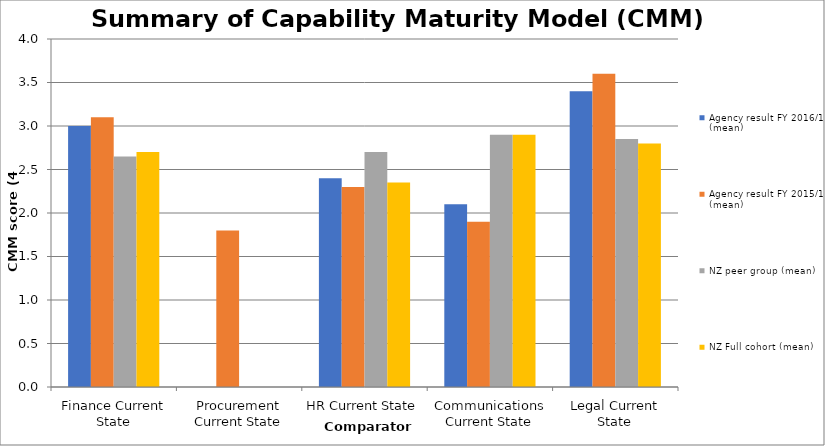
| Category | Agency result FY 2016/17 (mean) | Agency result FY 2015/16 (mean) | NZ peer group (mean) | NZ Full cohort (mean) |
|---|---|---|---|---|
| Finance Current State | 3 | 3.1 | 2.65 | 2.7 |
| Procurement Current State | 0 | 1.8 | 0 | 0 |
| HR Current State | 2.4 | 2.3 | 2.7 | 2.35 |
| Communications Current State | 2.1 | 1.9 | 2.9 | 2.9 |
| Legal Current State | 3.4 | 3.6 | 2.85 | 2.8 |